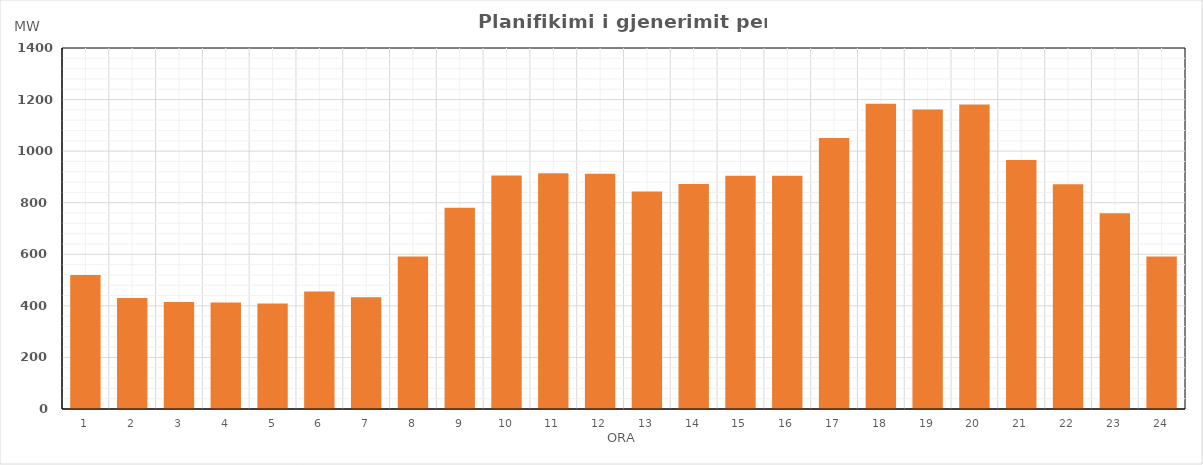
| Category | Max (MW) |
|---|---|
| 0 | 519.3 |
| 1 | 430.65 |
| 2 | 415 |
| 3 | 413 |
| 4 | 409 |
| 5 | 455.51 |
| 6 | 433.31 |
| 7 | 591.83 |
| 8 | 780.37 |
| 9 | 905.57 |
| 10 | 913.85 |
| 11 | 911.9 |
| 12 | 843.37 |
| 13 | 872.34 |
| 14 | 904.88 |
| 15 | 904.57 |
| 16 | 1050.9 |
| 17 | 1183.85 |
| 18 | 1161.81 |
| 19 | 1180.49 |
| 20 | 965.3 |
| 21 | 871.21 |
| 22 | 759.47 |
| 23 | 591.53 |